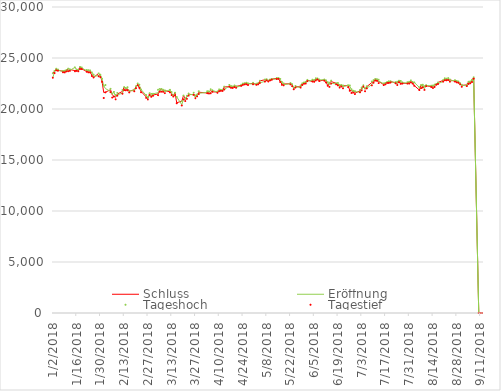
| Category | Schluss | Eröffnung | Tageshoch | Tagestief |
|---|---|---|---|---|
| 1/2/18 | 23506.33 | 23073.73 | 23506.33 | 23065.2 |
| 1/3/18 | 23714.53 | 23643 | 23730.47 | 23520.52 |
| 1/4/18 | 23849.99 | 23948.97 | 23952.61 | 23789.03 |
| 1/5/18 | 23788.2 | 23832.81 | 23864.76 | 23755.45 |
| 1/8/18 | 23710.43 | 23656.39 | 23734.97 | 23601.84 |
| 1/9/18 | 23653.82 | 23719.66 | 23743.05 | 23588.07 |
| 1/10/18 | 23714.88 | 23827.98 | 23833.27 | 23685.02 |
| 1/11/18 | 23951.81 | 23721.17 | 23962.07 | 23701.83 |
| 1/12/18 | 23868.34 | 23783.42 | 23891.63 | 23739.17 |
| 1/15/18 | 23763.37 | 24078.93 | 24084.42 | 23699.47 |
| 1/16/18 | 23808.06 | 23854.11 | 23872.69 | 23735.61 |
| 1/17/18 | 23816.33 | 23797.84 | 23816.33 | 23697.81 |
| 1/18/18 | 24124.15 | 23924.4 | 24129.34 | 23916.02 |
| 1/19/18 | 23940.78 | 24026.43 | 24072.77 | 23917.14 |
| 1/22/18 | 23669.49 | 23750.65 | 23828.4 | 23649.03 |
| 1/23/18 | 23631.88 | 23757.34 | 23797.96 | 23592.28 |
| 1/24/18 | 23629.34 | 23707.14 | 23787.23 | 23580.17 |
| 1/25/18 | 23291.97 | 23559.33 | 23581.98 | 23233.37 |
| 1/26/18 | 23098.29 | 23205.23 | 23375.38 | 23092.85 |
| 1/29/18 | 23486.11 | 23276.1 | 23492.77 | 23211.12 |
| 1/30/18 | 23274.53 | 23361.67 | 23367.96 | 23122.45 |
| 1/31/18 | 22682.08 | 22921.16 | 22967.69 | 22659.43 |
| 2/1/18 | 21610.24 | 22267 | 22277.45 | 21078.71 |
| 2/2/18 | 21645.37 | 22001.29 | 22353.87 | 21627.13 |
| 2/5/18 | 21890.86 | 21721.57 | 21977.03 | 21649.7 |
| 2/6/18 | 21382.62 | 21507.74 | 21510.3 | 21119.01 |
| 2/7/18 | 21244.68 | 21633.34 | 21679.2 | 21211.53 |
| 2/8/18 | 21154.17 | 21251.24 | 21371.01 | 20950.15 |
| 2/9/18 | 21464.98 | 21384.1 | 21578.99 | 21308.92 |
| 2/12/18 | 21720.25 | 21555.99 | 21866.37 | 21499.88 |
| 2/13/18 | 22149.21 | 21903.66 | 22152.85 | 21858.33 |
| 2/14/18 | 21925.1 | 22054.32 | 22063.87 | 21831.45 |
| 2/15/18 | 21970.81 | 21942.42 | 22130.58 | 21836.73 |
| 2/16/18 | 21736.44 | 21789.88 | 21799.4 | 21626.85 |
| 2/19/18 | 21892.78 | 21789.72 | 21903.39 | 21741.63 |
| 2/20/18 | 22153.63 | 22134.64 | 22226.53 | 22040.87 |
| 2/21/18 | 22389.86 | 22391.67 | 22502.05 | 22325.07 |
| 2/22/18 | 22068.24 | 22292.53 | 22380.28 | 22068.24 |
| 2/23/18 | 21724.47 | 21901.13 | 21901.13 | 21645.22 |
| 2/26/18 | 21181.64 | 21339.98 | 21366.09 | 21088.96 |
| 2/27/18 | 21042.09 | 21047.81 | 21164.38 | 20937.26 |
| 2/28/18 | 21417.76 | 21390.2 | 21551.14 | 21381.42 |
| 3/1/18 | 21252.72 | 21261.96 | 21484.08 | 21201.94 |
| 3/2/18 | 21368.07 | 21488.16 | 21488.16 | 21299.4 |
| 3/5/18 | 21469.2 | 21594.22 | 21884.45 | 21357.55 |
| 3/6/18 | 21824.03 | 21826.1 | 21971.16 | 21689.97 |
| 3/7/18 | 21968.1 | 21742.45 | 21968.1 | 21700.78 |
| 3/8/18 | 21777.29 | 21764.99 | 21881.09 | 21684.02 |
| 3/9/18 | 21803.95 | 21704.14 | 21825.97 | 21555.49 |
| 3/12/18 | 21676.51 | 21876.53 | 21879.28 | 21632.85 |
| 3/13/18 | 21480.9 | 21537.9 | 21659.04 | 21366.88 |
| 3/14/18 | 21380.97 | 21297.98 | 21384.86 | 21223.97 |
| 3/15/18 | 21591.99 | 21352.16 | 21592 | 21349.71 |
| 3/16/18 | 20617.86 | 21188.8 | 21188.8 | 20559.61 |
| 3/19/18 | 20766.1 | 20423.37 | 20766.1 | 20347.49 |
| 3/20/18 | 21317.32 | 20958.9 | 21317.32 | 20943.31 |
| 3/21/18 | 21031.31 | 20893.05 | 21031.31 | 20776.82 |
| 3/22/18 | 21159.08 | 21250.96 | 21298.57 | 20996.22 |
| 3/23/18 | 21454.3 | 21392.42 | 21512.8 | 21311.5 |
| 3/26/18 | 21388.58 | 21441.57 | 21597.47 | 21388.58 |
| 3/27/18 | 21292.29 | 21115.48 | 21333.5 | 21056.02 |
| 3/28/18 | 21319.55 | 21415.85 | 21415.85 | 21238.18 |
| 3/29/18 | 21645.42 | 21541.18 | 21737.66 | 21462.1 |
| 4/3/18 | 21567.52 | 21633.73 | 21742.84 | 21550.42 |
| 4/4/18 | 21678.26 | 21534.33 | 21737.09 | 21517.77 |
| 4/5/18 | 21794.32 | 21599.67 | 21933.99 | 21542.37 |
| 4/6/18 | 21687.1 | 21819.09 | 21837.36 | 21687.1 |
| 4/9/18 | 21660.28 | 21657.87 | 21719.43 | 21591.39 |
| 4/10/18 | 21778.74 | 21801.41 | 21917.35 | 21746.69 |
| 4/11/18 | 21835.53 | 21843.55 | 21879.69 | 21775.61 |
| 4/12/18 | 21847.59 | 21801.83 | 21889.89 | 21772.42 |
| 4/13/18 | 22158.2 | 21929.01 | 22194.11 | 21914.96 |
| 4/16/18 | 22191.18 | 22231.86 | 22360.65 | 22176.86 |
| 4/17/18 | 22162.24 | 22148.22 | 22261.35 | 22076.63 |
| 4/18/18 | 22088.04 | 22157.88 | 22204.86 | 22065.52 |
| 4/19/18 | 22278.12 | 22228.82 | 22304.69 | 22149.59 |
| 4/20/18 | 22215.32 | 22118.62 | 22228.78 | 22080.76 |
| 4/23/18 | 22319.61 | 22278.77 | 22381.66 | 22265.2 |
| 4/24/18 | 22467.87 | 22466.66 | 22495.56 | 22357.53 |
| 4/25/18 | 22508.03 | 22453.42 | 22519.45 | 22411.43 |
| 4/26/18 | 22472.78 | 22568.19 | 22568.19 | 22426.55 |
| 4/27/18 | 22467.16 | 22513.22 | 22513.48 | 22350.91 |
| 4/30/18 | 22508.69 | 22440.65 | 22566.68 | 22423.23 |
| 5/2/18 | 22408.88 | 22463.01 | 22478.64 | 22364.75 |
| 5/3/18 | 22497.18 | 22482.51 | 22530.64 | 22418.75 |
| 5/4/18 | 22758.48 | 22573.95 | 22769.16 | 22545.47 |
| 5/7/18 | 22865.86 | 22705.3 | 22894.76 | 22683.64 |
| 5/8/18 | 22818.02 | 22889.47 | 22912.06 | 22805.72 |
| 5/9/18 | 22717.23 | 22730.12 | 22796.14 | 22695.84 |
| 5/10/18 | 22838.37 | 22820.62 | 22887.03 | 22799.16 |
| 5/11/18 | 22930.36 | 22907.2 | 22954.19 | 22867.3 |
| 5/14/18 | 23002.37 | 22937.58 | 23050.39 | 22935.31 |
| 5/15/18 | 22960.34 | 23025.95 | 23031.67 | 22952.87 |
| 5/16/18 | 22689.74 | 22868.79 | 22949.73 | 22649.85 |
| 5/17/18 | 22437.01 | 22621.29 | 22644.69 | 22366.6 |
| 5/18/18 | 22450.79 | 22380.22 | 22509.36 | 22318.15 |
| 5/22/18 | 22481.09 | 22488.95 | 22547.67 | 22410.91 |
| 5/23/18 | 22358.43 | 22431.95 | 22439.1 | 22240.39 |
| 5/24/18 | 22018.52 | 22051.97 | 22079.23 | 21931.65 |
| 5/25/18 | 22201.82 | 22163.4 | 22254.42 | 22098 |
| 5/28/18 | 22171.35 | 22126.25 | 22316.91 | 22098.04 |
| 5/29/18 | 22475.94 | 22365.09 | 22515.72 | 22355.83 |
| 5/30/18 | 22539.54 | 22552.17 | 22602.13 | 22470.04 |
| 5/31/18 | 22625.73 | 22520.31 | 22662.82 | 22498.59 |
| 6/1/18 | 22823.26 | 22748.72 | 22856.37 | 22732.18 |
| 6/4/18 | 22694.5 | 22799.38 | 22879 | 22694.5 |
| 6/5/18 | 22804.04 | 22686.95 | 22856.08 | 22667.3 |
| 6/6/18 | 22878.35 | 22977.22 | 23011.57 | 22797.73 |
| 6/7/18 | 22966.38 | 22896.17 | 22993.26 | 22895.31 |
| 6/8/18 | 22738.61 | 22842.96 | 22898.39 | 22738.61 |
| 6/11/18 | 22851.75 | 22883.24 | 22885.84 | 22770.38 |
| 6/12/18 | 22680.33 | 22806.57 | 22806.89 | 22601.13 |
| 6/13/18 | 22278.48 | 22565.92 | 22618.52 | 22278.48 |
| 6/14/18 | 22555.43 | 22338.53 | 22581.4 | 22167.16 |
| 6/15/18 | 22693.04 | 22523.28 | 22782.01 | 22491.08 |
| 6/18/18 | 22516.83 | 22456.45 | 22535.65 | 22414.18 |
| 6/19/18 | 22338.15 | 22543.56 | 22556.55 | 22312.79 |
| 6/20/18 | 22342 | 22160.33 | 22368.78 | 22104.12 |
| 6/21/18 | 22271.77 | 22320.88 | 22356.54 | 22205.34 |
| 6/22/18 | 22270.39 | 22195.19 | 22299.39 | 22038.4 |
| 6/25/18 | 22304.51 | 22314.47 | 22332.82 | 22145.48 |
| 6/26/18 | 21811.93 | 22233.8 | 22312.25 | 21784.48 |
| 6/27/18 | 21785.54 | 21889.06 | 21927.81 | 21574.56 |
| 6/28/18 | 21717.04 | 21679 | 21784 | 21604.18 |
| 6/29/18 | 21546.99 | 21697.44 | 21751.5 | 21462.95 |
| 7/2/18 | 21788.14 | 21647.66 | 21866.16 | 21642.96 |
| 7/3/18 | 22052.18 | 21838.53 | 22105.95 | 21825.76 |
| 7/4/18 | 22196.89 | 22215.34 | 22321.6 | 22196.89 |
| 7/5/18 | 21932.21 | 22002.14 | 22044.62 | 21744.25 |
| 7/6/18 | 22187.96 | 22036.87 | 22233.52 | 22019.19 |
| 7/9/18 | 22597.35 | 22397.62 | 22692.86 | 22316.52 |
| 7/10/18 | 22697.36 | 22605.73 | 22832.22 | 22575.42 |
| 7/11/18 | 22794.19 | 22917.52 | 22949.32 | 22794.19 |
| 7/12/18 | 22764.68 | 22871.62 | 22926.47 | 22761.87 |
| 7/13/18 | 22697.88 | 22734.56 | 22869.98 | 22541.35 |
| 7/16/18 | 22396.99 | 22480.33 | 22507.17 | 22341.87 |
| 7/17/18 | 22510.48 | 22555.05 | 22555.05 | 22416.23 |
| 7/18/18 | 22614.25 | 22594.28 | 22645.66 | 22547.14 |
| 7/19/18 | 22586.87 | 22711.59 | 22717.15 | 22549.77 |
| 7/20/18 | 22712.75 | 22646.48 | 22712.75 | 22593.2 |
| 7/23/18 | 22544.84 | 22613.3 | 22631.32 | 22518.94 |
| 7/24/18 | 22553.72 | 22472.12 | 22678.06 | 22352.21 |
| 7/25/18 | 22746.7 | 22642.18 | 22775.47 | 22615.98 |
| 7/26/18 | 22512.53 | 22676.73 | 22754.73 | 22464.81 |
| 7/27/18 | 22525.18 | 22585.54 | 22613.5 | 22490.57 |
| 7/30/18 | 22507.32 | 22536.05 | 22635.68 | 22486.74 |
| 7/31/18 | 22662.74 | 22514.31 | 22666.68 | 22499.05 |
| 8/1/18 | 22644.31 | 22666.56 | 22800.61 | 22610.29 |
| 8/2/18 | 22598.39 | 22591.54 | 22648.88 | 22497.99 |
| 8/3/18 | 22298.08 | 22606.91 | 22608.86 | 22272.69 |
| 8/6/18 | 21857.43 | 22117.57 | 22124.6 | 21851.32 |
| 8/7/18 | 22356.08 | 22053.07 | 22356.08 | 22047.19 |
| 8/8/18 | 22204.22 | 22368.12 | 22380.28 | 22110.29 |
| 8/9/18 | 22192.04 | 21980.82 | 22240.42 | 21871.7 |
| 8/10/18 | 22270.38 | 22313.19 | 22340.95 | 22244.1 |
| 8/13/18 | 22199 | 22267.07 | 22288.31 | 22150.75 |
| 8/14/18 | 22219.73 | 22110.54 | 22306.83 | 22053.14 |
| 8/15/18 | 22362.55 | 22270.04 | 22390.2 | 22162.81 |
| 8/16/18 | 22410.82 | 22420.67 | 22463.03 | 22377.88 |
| 8/17/18 | 22601.77 | 22484.01 | 22602.24 | 22452.42 |
| 8/20/18 | 22799.64 | 22693.69 | 22838.06 | 22682.39 |
| 8/21/18 | 22813.47 | 22967.74 | 23006.77 | 22813.47 |
| 8/22/18 | 22848.22 | 22820.86 | 22968.18 | 22819.97 |
| 8/23/18 | 22869.5 | 23020.18 | 23032.17 | 22832.83 |
| 8/24/18 | 22865.15 | 22733.25 | 22890.61 | 22678.03 |
| 8/27/18 | 22707.38 | 22819.17 | 22820.48 | 22684.43 |
| 8/28/18 | 22696.9 | 22740.05 | 22753.18 | 22612.15 |
| 8/29/18 | 22580.83 | 22663.8 | 22692.25 | 22570.52 |
| 8/30/18 | 22487.94 | 22458.97 | 22535.34 | 22416.63 |
| 8/31/18 | 22307.06 | 22351.84 | 22372.89 | 22172.9 |
| 9/3/18 | 22373.09 | 22253.65 | 22396.88 | 22249.61 |
| 9/4/18 | 22664.69 | 22469.78 | 22667.85 | 22457.1 |
| 9/5/18 | 22604.61 | 22702.71 | 22709.37 | 22522.17 |
| 9/6/18 | 22821.32 | 22657.95 | 22858.41 | 22643.88 |
| 9/7/18 | 23094.67 | 23035.78 | 23105.28 | 22965.48 |
| 9/10/18 | 0 | 0 | 0 | 0 |
| 9/11/18 | 0 | 0 | 0 | 0 |
| 9/12/18 | 0 | 0 | 0 | 0 |